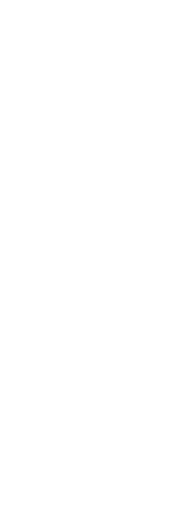
| Category | Series 10 | Mask |
|---|---|---|
| 0 | 8 | 1 |